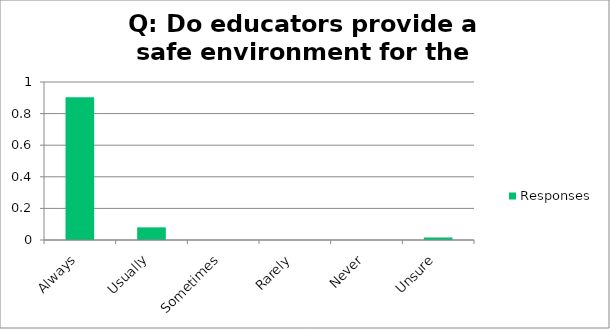
| Category | Responses |
|---|---|
| Always | 0.904 |
| Usually | 0.08 |
| Sometimes | 0 |
| Rarely | 0 |
| Never | 0 |
| Unsure | 0.016 |